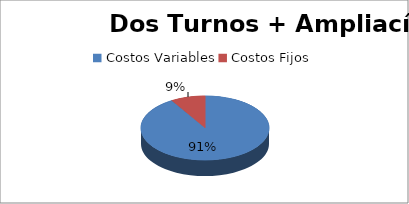
| Category | Series 0 |
|---|---|
| 0 | 482256911.496 |
| 1 | 45931100 |